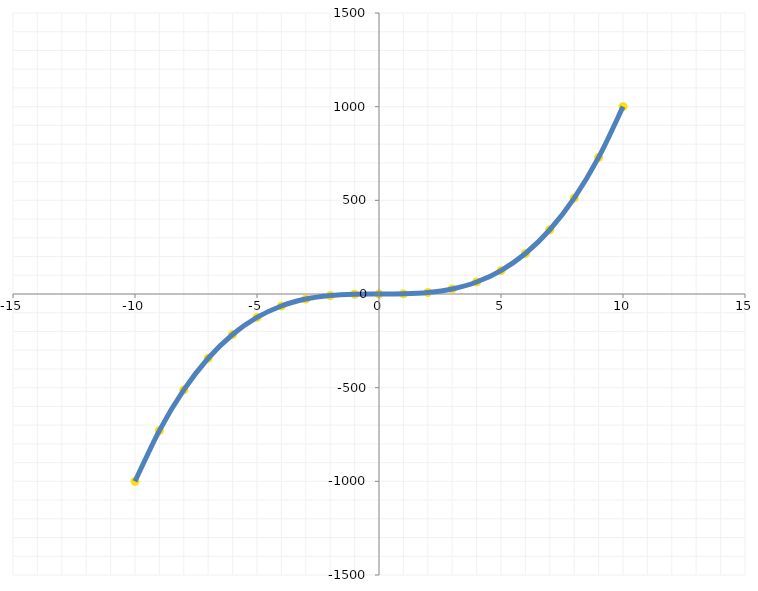
| Category | Series 0 |
|---|---|
| -10.0 | -1000 |
| -9.0 | -729 |
| -8.0 | -512 |
| -7.0 | -343 |
| -6.0 | -216 |
| -5.0 | -125 |
| -4.0 | -64 |
| -3.0 | -27 |
| -2.0 | -8 |
| -1.0 | -1 |
| 0.0 | 0 |
| 1.0 | 1 |
| 2.0 | 8 |
| 3.0 | 27 |
| 4.0 | 64 |
| 5.0 | 125 |
| 6.0 | 216 |
| 7.0 | 343 |
| 8.0 | 512 |
| 9.0 | 729 |
| 10.0 | 1000 |